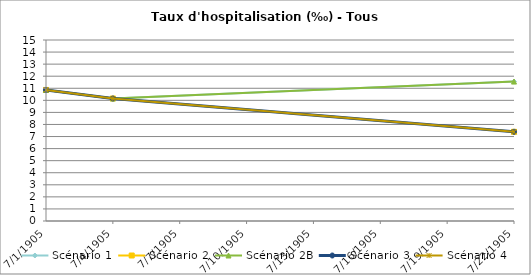
| Category | Scénario 1 | Scénario 2 | Scénario 2B | Scénario 3 | Scénario 4 |
|---|---|---|---|---|---|
| 2009.0 | 10.861 | 10.861 | 10.861 | 10.861 | 10.861 |
| 2012.0 | 10.152 | 10.152 | 10.152 | 10.152 | 10.152 |
| 2030.0 | 11.554 | 7.393 | 11.554 | 7.393 | 7.393 |